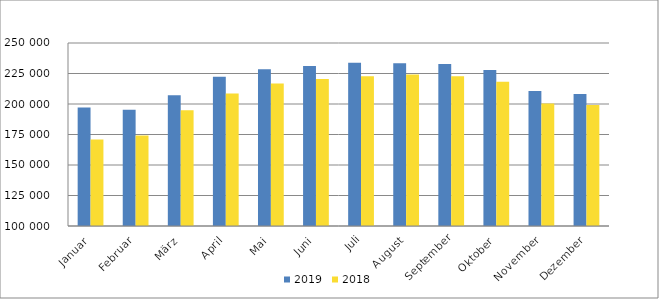
| Category | 2019 | 2018 |
|---|---|---|
| Januar | 197233 | 170977 |
| Februar | 195227 | 174274 |
| März | 207079 | 194869 |
| April | 222430 | 208567 |
| Mai | 228514 | 216876 |
| Juni | 231048 | 220589 |
| Juli | 233904 | 222783 |
| August | 233468 | 224105 |
| September | 232871 | 222727 |
| Oktober | 227830 | 218166 |
| November | 210604 | 200475 |
| Dezember | 208136 | 199096 |